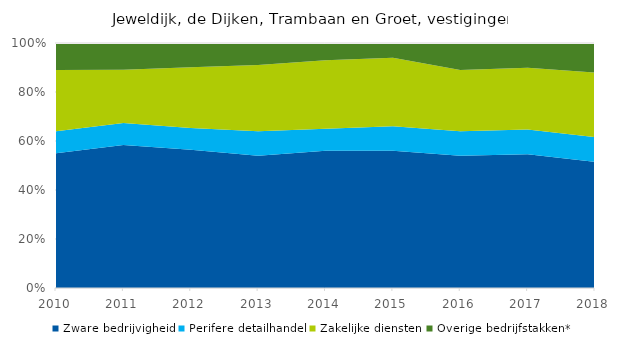
| Category | Zware bedrijvigheid | Perifere detailhandel | Zakelijke diensten | Overige bedrijfstakken* |
|---|---|---|---|---|
| 2010 | 0.55 | 0.09 | 0.25 | 0.11 |
| 2011 | 0.59 | 0.09 | 0.22 | 0.11 |
| 2012 | 0.57 | 0.09 | 0.25 | 0.1 |
| 2013 | 0.54 | 0.1 | 0.27 | 0.09 |
| 2014 | 0.56 | 0.09 | 0.28 | 0.07 |
| 2015 | 0.56 | 0.1 | 0.28 | 0.06 |
| 2016 | 0.54 | 0.1 | 0.25 | 0.11 |
| 2017 | 0.54 | 0.1 | 0.25 | 0.1 |
| 2018 | 0.51 | 0.1 | 0.26 | 0.12 |